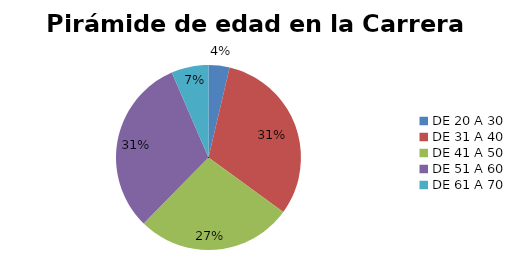
| Category | TOTAL |
|---|---|
| DE 20 A 30 | 90 |
| DE 31 A 40 | 768 |
| DE 41 A 50 | 670 |
| DE 51 A 60 | 763 |
| DE 61 A 70 | 159 |